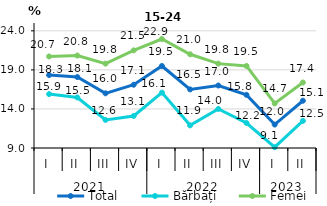
| Category | Total | Bărbați | Femei |
|---|---|---|---|
| 0 | 18.335 | 15.899 | 20.718 |
| 1 | 18.083 | 15.467 | 20.834 |
| 2 | 16 | 12.6 | 19.8 |
| 3 | 17.1 | 13.1 | 21.5 |
| 4 | 19.497 | 16.088 | 22.949 |
| 5 | 16.5 | 11.9 | 21 |
| 6 | 17 | 14 | 19.8 |
| 7 | 15.8 | 12.2 | 19.5 |
| 8 | 12 | 9.1 | 14.7 |
| 9 | 15.051 | 12.471 | 17.384 |